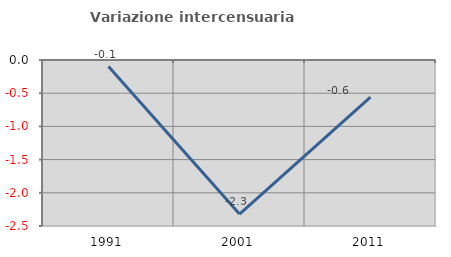
| Category | Variazione intercensuaria annua |
|---|---|
| 1991.0 | -0.099 |
| 2001.0 | -2.321 |
| 2011.0 | -0.56 |